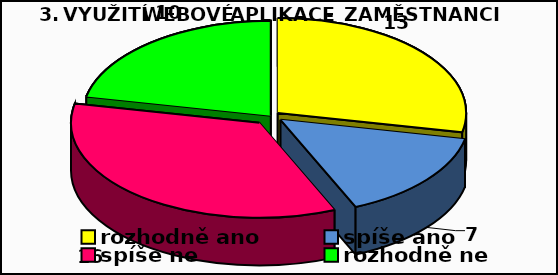
| Category | Series 0 |
|---|---|
| rozhodně ano | 13 |
| spíše ano  | 7 |
| spíše ne  | 16 |
| rozhodně ne | 10 |